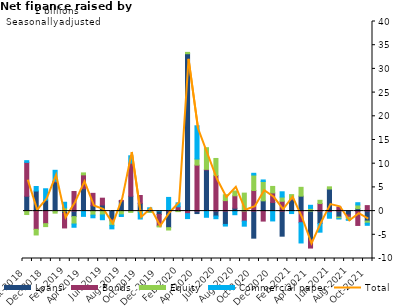
| Category | Loans | Bonds | Equity | Commercial paper |
|---|---|---|---|---|
| Oct-2018 | 3.14 | 7.138 | -0.724 | 0.363 |
| Nov-2018 | 4.235 | -3.846 | -1.19 | 0.958 |
| Dec-2018 | 2.306 | -2.65 | -0.621 | 2.407 |
| Jan-2019 | 6.135 | 0.161 | -0.433 | 2.312 |
| Feb-2019 | -0.47 | -3.084 | 0.682 | 1.181 |
| Mar-2019 | -1.166 | 4.131 | -1.563 | -0.683 |
| Apr-2019 | 4.73 | 2.92 | 0.41 | -1.109 |
| May-2019 | 1.122 | 2.622 | -0.847 | -0.561 |
| Jun-2019 | 1.288 | 1.437 | -0.816 | -1.001 |
| Jul-2019 | -1.782 | -0.281 | -0.94 | -0.742 |
| Aug-2019 | 2.089 | 0.174 | -0.787 | -0.357 |
| Sep-2019 | 3.139 | 6.981 | -0.273 | 1.548 |
| Oct-2019 | 1.635 | 1.651 | -0.255 | -1.416 |
| Nov-2019 | 0.042 | -0.195 | -0.097 | 0.654 |
| Dec-2019 | -0.711 | -2.415 | -0.214 | 0.031 |
| Jan-2020 | -3.493 | 0.155 | -0.499 | 2.731 |
| Feb-2020 | 0.15 | 0.764 | -0.112 | 0.826 |
| Mar-2020 | 33.199 | -0.54 | 0.285 | -1.041 |
| Apr-2020 | -0.518 | 9.698 | 1.29 | 7.014 |
| May-2020 | 8.682 | 0.131 | 4.562 | -1.303 |
| Jun-2020 | -1.042 | 7.494 | 3.61 | -0.564 |
| Jul-2020 | -2.813 | 2.212 | 1.238 | -0.34 |
| Aug-2020 | 0.621 | 2.614 | 1.007 | -0.762 |
| Sep-2020 | 0.033 | -2.122 | 3.762 | -1.058 |
| Oct-2020 | -5.708 | 4.349 | 3.26 | 0.366 |
| Nov-2020 | 2.165 | -2.106 | 4.079 | 0.327 |
| Dec-2020 | 1.822 | 2.015 | 1.37 | -2.076 |
| Jan-2021 | -5.29 | 2.081 | 0.882 | 1.11 |
| Feb-2021 | 2.378 | 0.193 | 0.908 | -0.517 |
| Mar-2021 | 3.156 | -2.452 | 1.859 | -4.272 |
| Apr-2021 | -6.042 | -1.754 | 0.573 | 0.65 |
| May-2021 | -2.629 | 1.596 | 0.683 | -1.817 |
| Jun-2021 | 4.658 | -0.338 | 0.461 | -1.166 |
| Jul-2021 | -1.256 | 0.867 | -0.333 | -0.072 |
| Aug-2021 | -0.807 | -0.499 | -0.496 | -0.136 |
| Sep-2021 | 0.513 | -3.026 | 0.776 | 0.481 |
| Oct-2021 | -2.101 | 1.158 | -0.451 | -0.446 |